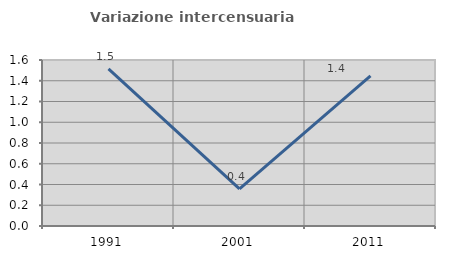
| Category | Variazione intercensuaria annua |
|---|---|
| 1991.0 | 1.514 |
| 2001.0 | 0.357 |
| 2011.0 | 1.447 |